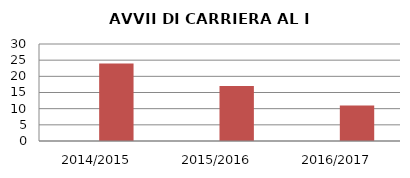
| Category | ANNO | NUMERO |
|---|---|---|
| 2014/2015 | 0 | 24 |
| 2015/2016 | 0 | 17 |
| 2016/2017 | 0 | 11 |